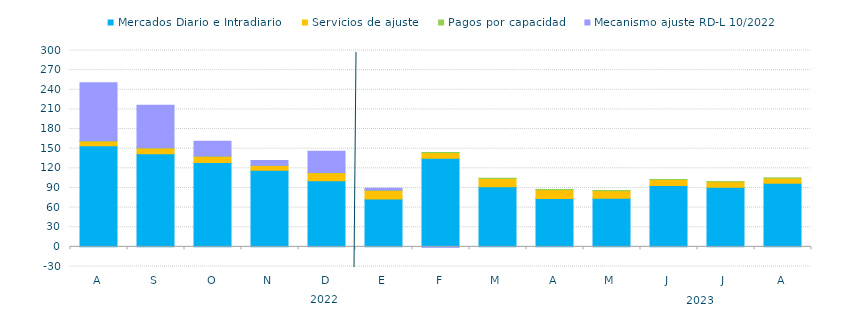
| Category | Mercados Diario e Intradiario  | Servicios de ajuste | Pagos por capacidad | Mecanismo ajuste RD-L 10/2022 |
|---|---|---|---|---|
| A | 154.49 | 7.3 | 0.26 | 88.84 |
| S | 142.07 | 8.97 | 0.26 | 64.97 |
| O | 128.7 | 9.9 | 0.21 | 22.457 |
| N | 117.14 | 7.26 | 0.31 | 7.12 |
| D | 101.17 | 12.19 | 0.43 | 32.16 |
| E | 73.09 | 13.307 | 0.34 | 2.9 |
| F | 135.43 | 8.36 | 0.35 | -0.71 |
| M | 91.9 | 12.55 | 0.24 | 0 |
| A | 74.07 | 13.35 | 0.16 | 0 |
| M | 74.232 | 11.563 | 0.171 | 0 |
| J | 93.62 | 9.11 | 0.19 | 0 |
| J | 91.14 | 8.186 | 0.32 | 0 |
| A | 97.02 | 7.99 | 0.19 | 0 |